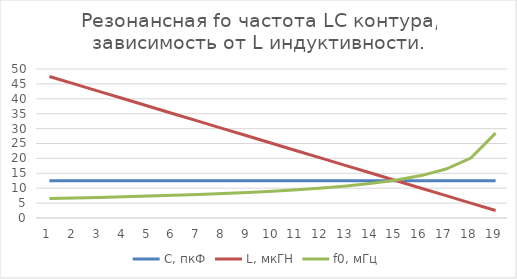
| Category | C, пкФ | L, мкГН | f0, мГц |
|---|---|---|---|
| 0 | 12.5 | 47.5 | 6.532 |
| 1 | 12.5 | 45 | 6.711 |
| 2 | 12.5 | 42.5 | 6.905 |
| 3 | 12.5 | 40 | 7.118 |
| 4 | 12.5 | 37.5 | 7.351 |
| 5 | 12.5 | 35 | 7.609 |
| 6 | 12.5 | 32.5 | 7.896 |
| 7 | 12.5 | 30 | 8.219 |
| 8 | 12.5 | 27.5 | 8.584 |
| 9 | 12.5 | 25 | 9.003 |
| 10 | 12.5 | 22.5 | 9.49 |
| 11 | 12.5 | 20 | 10.066 |
| 12 | 12.5 | 17.5 | 10.761 |
| 13 | 12.5 | 15 | 11.623 |
| 14 | 12.5 | 12.5 | 12.732 |
| 15 | 12.5 | 10 | 14.235 |
| 16 | 12.5 | 7.5 | 16.437 |
| 17 | 12.5 | 5 | 20.132 |
| 18 | 12.5 | 2.5 | 28.471 |